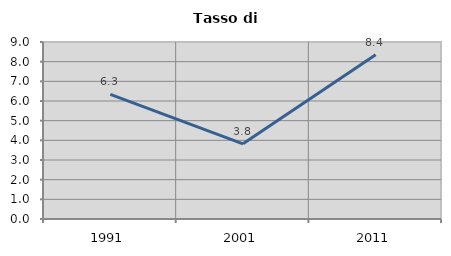
| Category | Tasso di disoccupazione   |
|---|---|
| 1991.0 | 6.34 |
| 2001.0 | 3.824 |
| 2011.0 | 8.351 |